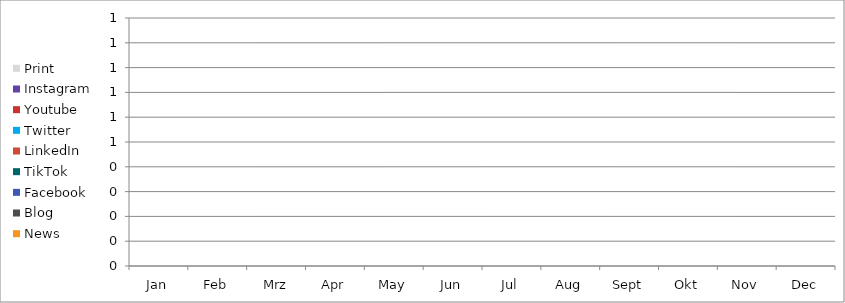
| Category | News | Blog | Facebook | TikTok | LinkedIn | Twitter | Youtube | Instagram | Print |
|---|---|---|---|---|---|---|---|---|---|
| Jan | 0 | 0 | 0 | 0 | 0 | 0 | 0 | 0 | 0 |
| Feb | 0 | 0 | 0 | 0 | 0 | 0 | 0 | 0 | 0 |
| Mrz | 0 | 0 | 0 | 0 | 0 | 0 | 0 | 0 | 0 |
| Apr | 0 | 0 | 0 | 0 | 0 | 0 | 0 | 0 | 0 |
| May | 0 | 0 | 0 | 0 | 0 | 0 | 0 | 0 | 0 |
| Jun | 0 | 0 | 0 | 0 | 0 | 0 | 0 | 0 | 0 |
| Jul | 0 | 0 | 0 | 0 | 0 | 0 | 0 | 0 | 0 |
| Aug | 0 | 0 | 0 | 0 | 0 | 0 | 0 | 0 | 0 |
| Sept | 0 | 0 | 0 | 0 | 0 | 0 | 0 | 0 | 0 |
| Okt | 0 | 0 | 0 | 0 | 0 | 0 | 0 | 0 | 0 |
| Nov | 0 | 0 | 0 | 0 | 0 | 0 | 0 | 0 | 0 |
| Dec | 0 | 0 | 0 | 0 | 0 | 0 | 0 | 0 | 0 |